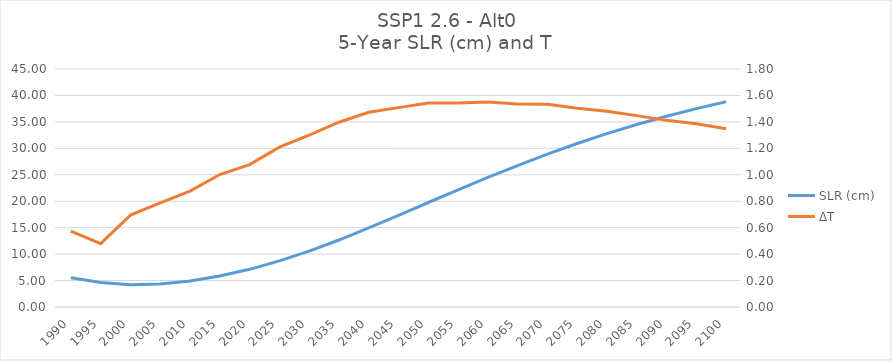
| Category | SLR (cm) |
|---|---|
| 1990.0 | 5.549 |
| 1995.0 | 4.625 |
| 2000.0 | 4.219 |
| 2005.0 | 4.353 |
| 2010.0 | 4.915 |
| 2015.0 | 5.869 |
| 2020.0 | 7.122 |
| 2025.0 | 8.712 |
| 2030.0 | 10.563 |
| 2035.0 | 12.665 |
| 2040.0 | 14.956 |
| 2045.0 | 17.329 |
| 2050.0 | 19.758 |
| 2055.0 | 22.148 |
| 2060.0 | 24.494 |
| 2065.0 | 26.737 |
| 2070.0 | 28.897 |
| 2075.0 | 30.909 |
| 2080.0 | 32.787 |
| 2085.0 | 34.509 |
| 2090.0 | 36.074 |
| 2095.0 | 37.512 |
| 2100.0 | 38.797 |